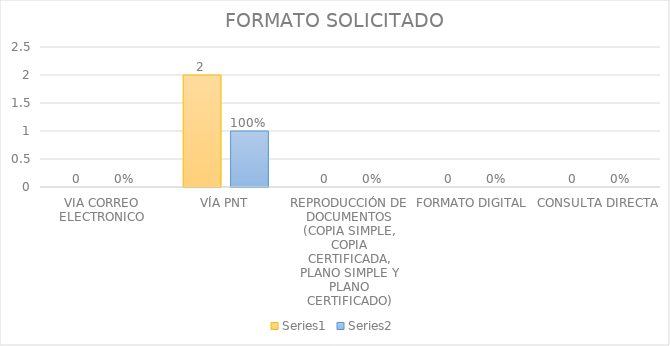
| Category | Series 3 | Series 4 |
|---|---|---|
| VIA CORREO ELECTRONICO | 0 | 0 |
| VÍA PNT | 2 | 1 |
| REPRODUCCIÓN DE DOCUMENTOS (COPIA SIMPLE, COPIA CERTIFICADA, PLANO SIMPLE Y PLANO CERTIFICADO) | 0 | 0 |
| FORMATO DIGITAL | 0 | 0 |
| CONSULTA DIRECTA | 0 | 0 |